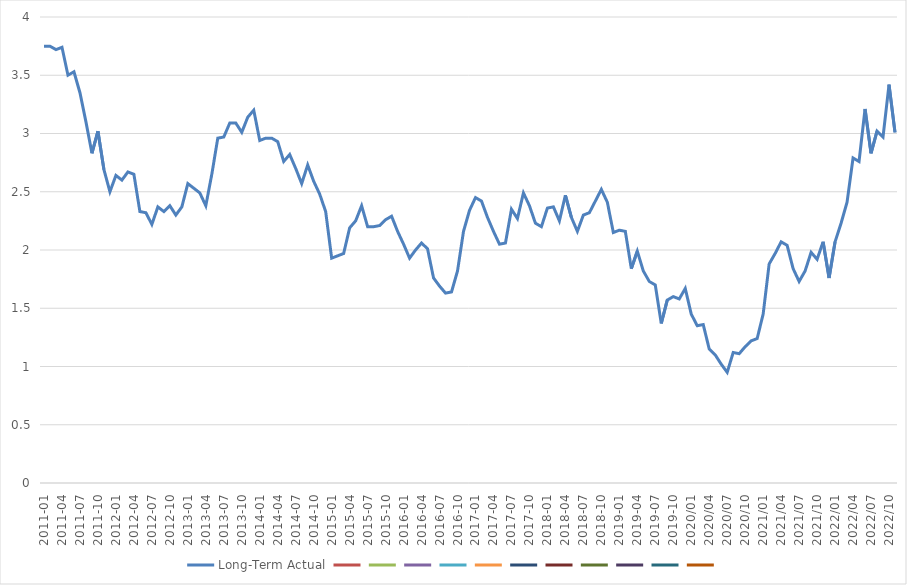
| Category | Long-Term Actual | Series 1 | Series 2 | Series 3 | Series 4 | Series 5 | Series 6 | Series 7 | Series 8 | Series 9 | Series 10 | Series 11 |
|---|---|---|---|---|---|---|---|---|---|---|---|---|
| 2011-01 | 3.75 |  |  |  |  |  |  |  |  |  |  |  |
| 2011-02 | 3.75 |  |  |  |  |  |  |  |  |  |  |  |
| 2011-03 | 3.72 |  |  |  |  |  |  |  |  |  |  |  |
| 2011-04 | 3.74 |  |  |  |  |  |  |  |  |  |  |  |
| 2011-05 | 3.5 |  |  |  |  |  |  |  |  |  |  |  |
| 2011-06 | 3.53 |  |  |  |  |  |  |  |  |  |  |  |
| 2011-07 | 3.35 |  |  |  |  |  |  |  |  |  |  |  |
| 2011-08 | 3.1 |  |  |  |  |  |  |  |  |  |  |  |
| 2011-09 | 2.83 |  |  |  |  |  |  |  |  |  |  |  |
| 2011-10 | 3.02 |  |  |  |  |  |  |  |  |  |  |  |
| 2011-11 | 2.69 |  |  |  |  |  |  |  |  |  |  |  |
| 2011-12 | 2.5 |  |  |  |  |  |  |  |  |  |  |  |
| 2012-01 | 2.64 |  |  |  |  |  |  |  |  |  |  |  |
| 2012-02 | 2.6 |  |  |  |  |  |  |  |  |  |  |  |
| 2012-03 | 2.67 |  |  |  |  |  |  |  |  |  |  |  |
| 2012-04 | 2.65 |  |  |  |  |  |  |  |  |  |  |  |
| 2012-05 | 2.33 |  |  |  |  |  |  |  |  |  |  |  |
| 2012-06 | 2.32 |  |  |  |  |  |  |  |  |  |  |  |
| 2012-07 | 2.22 |  |  |  |  |  |  |  |  |  |  |  |
| 2012-08 | 2.37 |  |  |  |  |  |  |  |  |  |  |  |
| 2012-09 | 2.33 |  |  |  |  |  |  |  |  |  |  |  |
| 2012-10 | 2.38 |  |  |  |  |  |  |  |  |  |  |  |
| 2012-11 | 2.3 |  |  |  |  |  |  |  |  |  |  |  |
| 2012-12 | 2.37 |  |  |  |  |  |  |  |  |  |  |  |
| 2013-01 | 2.57 |  |  |  |  |  |  |  |  |  |  |  |
| 2013-02 | 2.53 |  |  |  |  |  |  |  |  |  |  |  |
| 2013-03 | 2.49 |  |  |  |  |  |  |  |  |  |  |  |
| 2013-04 | 2.38 |  |  |  |  |  |  |  |  |  |  |  |
| 2013-05 | 2.65 |  |  |  |  |  |  |  |  |  |  |  |
| 2013-06 | 2.96 |  |  |  |  |  |  |  |  |  |  |  |
| 2013-07 | 2.97 |  |  |  |  |  |  |  |  |  |  |  |
| 2013-08 | 3.09 |  |  |  |  |  |  |  |  |  |  |  |
| 2013-09 | 3.09 |  |  |  |  |  |  |  |  |  |  |  |
| 2013-10 | 3.01 |  |  |  |  |  |  |  |  |  |  |  |
| 2013-11 | 3.14 |  |  |  |  |  |  |  |  |  |  |  |
| 2013-12 | 3.2 |  |  |  |  |  |  |  |  |  |  |  |
| 2014-01 | 2.94 |  |  |  |  |  |  |  |  |  |  |  |
| 2014-02 | 2.96 |  |  |  |  |  |  |  |  |  |  |  |
| 2014-03 | 2.96 |  |  |  |  |  |  |  |  |  |  |  |
| 2014-04 | 2.93 |  |  |  |  |  |  |  |  |  |  |  |
| 2014-05 | 2.76 |  |  |  |  |  |  |  |  |  |  |  |
| 2014-06 | 2.82 |  |  |  |  |  |  |  |  |  |  |  |
| 2014-07 | 2.7 |  |  |  |  |  |  |  |  |  |  |  |
| 2014-08 | 2.57 |  |  |  |  |  |  |  |  |  |  |  |
| 2014-09 | 2.73 |  |  |  |  |  |  |  |  |  |  |  |
| 2014-10 | 2.59 |  |  |  |  |  |  |  |  |  |  |  |
| 2014-11 | 2.48 |  |  |  |  |  |  |  |  |  |  |  |
| 2014-12 | 2.33 |  |  |  |  |  |  |  |  |  |  |  |
| 2015-01 | 1.93 |  |  |  |  |  |  |  |  |  |  |  |
| 2015-02 | 1.95 |  |  |  |  |  |  |  |  |  |  |  |
| 2015-03 | 1.97 |  |  |  |  |  |  |  |  |  |  |  |
| 2015-04 | 2.19 |  |  |  |  |  |  |  |  |  |  |  |
| 2015-05 | 2.25 |  |  |  |  |  |  |  |  |  |  |  |
| 2015-06 | 2.38 |  |  |  |  |  |  |  |  |  |  |  |
| 2015-07 | 2.2 |  |  |  |  |  |  |  |  |  |  |  |
| 2015-08 | 2.2 |  |  |  |  |  |  |  |  |  |  |  |
| 2015-09 | 2.21 |  |  |  |  |  |  |  |  |  |  |  |
| 2015-10 | 2.26 |  |  |  |  |  |  |  |  |  |  |  |
| 2015-11 | 2.29 |  |  |  |  |  |  |  |  |  |  |  |
| 2015-12 | 2.16 |  |  |  |  |  |  |  |  |  |  |  |
| 2016-01 | 2.05 |  |  |  |  |  |  |  |  |  |  |  |
| 2016-02 | 1.93 |  |  |  |  |  |  |  |  |  |  |  |
| 2016-03 | 2 |  |  |  |  |  |  |  |  |  |  |  |
| 2016-04 | 2.06 |  |  |  |  |  |  |  |  |  |  |  |
| 2016-05 | 2.01 |  |  |  |  |  |  |  |  |  |  |  |
| 2016-06 | 1.76 |  |  |  |  |  |  |  |  |  |  |  |
| 2016-07 | 1.69 |  |  |  |  |  |  |  |  |  |  |  |
| 2016-08 | 1.63 |  |  |  |  |  |  |  |  |  |  |  |
| 2016-09 | 1.64 |  |  |  |  |  |  |  |  |  |  |  |
| 2016-10 | 1.82 |  |  |  |  |  |  |  |  |  |  |  |
| 2016-11 | 2.16 |  |  |  |  |  |  |  |  |  |  |  |
| 2016-12 | 2.34 |  |  |  |  |  |  |  |  |  |  |  |
| 2017-01 | 2.45 |  |  |  |  |  |  |  |  |  |  |  |
| 2017-02 | 2.42 |  |  |  |  |  |  |  |  |  |  |  |
| 2017-03 | 2.28 |  |  |  |  |  |  |  |  |  |  |  |
| 2017-04 | 2.16 |  |  |  |  |  |  |  |  |  |  |  |
| 2017-05 | 2.05 |  |  |  |  |  |  |  |  |  |  |  |
| 2017-06 | 2.06 |  |  |  |  |  |  |  |  |  |  |  |
| 2017-07 | 2.35 |  |  |  |  |  |  |  |  |  |  |  |
| 2017-08 | 2.27 |  |  |  |  |  |  |  |  |  |  |  |
| 2017-09 | 2.49 |  |  |  |  |  |  |  |  |  |  |  |
| 2017-10 | 2.38 |  |  |  |  |  |  |  |  |  |  |  |
| 2017-11 | 2.23 |  |  |  |  |  |  |  |  |  |  |  |
| 2017-12 | 2.2 |  |  |  |  |  |  |  |  |  |  |  |
| 2018-01 | 2.36 |  |  |  |  |  |  |  |  |  |  |  |
| 2018-02 | 2.37 |  |  |  |  |  |  |  |  |  |  |  |
| 2018-03 | 2.25 |  |  |  |  |  |  |  |  |  |  |  |
| 2018-04 | 2.47 |  |  |  |  |  |  |  |  |  |  |  |
| 2018-05 | 2.28 |  |  |  |  |  |  |  |  |  |  |  |
| 2018-06 | 2.16 |  |  |  |  |  |  |  |  |  |  |  |
| 2018-07 | 2.3 |  |  |  |  |  |  |  |  |  |  |  |
| 2018-08 | 2.32 |  |  |  |  |  |  |  |  |  |  |  |
| 2018-09 | 2.42 |  |  |  |  |  |  |  |  |  |  |  |
| 2018-10 | 2.52 |  |  |  |  |  |  |  |  |  |  |  |
| 2018-11 | 2.41 |  |  |  |  |  |  |  |  |  |  |  |
| 2018-12 | 2.15 |  |  |  |  |  |  |  |  |  |  |  |
| 2019-01 | 2.17 |  |  |  |  |  |  |  |  |  |  |  |
| 2019-02 | 2.16 |  |  |  |  |  |  |  |  |  |  |  |
| 2019-03 | 1.84 |  |  |  |  |  |  |  |  |  |  |  |
| 2019-04 | 1.99 |  |  |  |  |  |  |  |  |  |  |  |
| 2019-05 | 1.82 |  |  |  |  |  |  |  |  |  |  |  |
| 2019-06 | 1.73 |  |  |  |  |  |  |  |  |  |  |  |
| 2019-07 | 1.7 |  |  |  |  |  |  |  |  |  |  |  |
| 2019-08 | 1.37 |  |  |  |  |  |  |  |  |  |  |  |
| 2019-09 | 1.57 |  |  |  |  |  |  |  |  |  |  |  |
| 2019-10 | 1.6 |  |  |  |  |  |  |  |  |  |  |  |
| 2019-11 | 1.58 |  |  |  |  |  |  |  |  |  |  |  |
| 2019-12 | 1.67 |  |  |  |  |  |  |  |  |  |  |  |
| 2020/01 | 1.45 |  |  |  |  |  |  |  |  |  |  |  |
| 2020/02 | 1.35 |  |  |  |  |  |  |  |  |  |  |  |
| 2020/02 | 1.36 |  |  |  |  |  |  |  |  |  |  |  |
| 2020/04 | 1.15 |  |  |  |  |  |  |  |  |  |  |  |
| 2020/05 | 1.1 |  |  |  |  |  |  |  |  |  |  |  |
| 2020/06 | 1.02 |  |  |  |  |  |  |  |  |  |  |  |
| 2020/07 | 0.95 |  |  |  |  |  |  |  |  |  |  |  |
| 2020/08 | 1.12 |  |  |  |  |  |  |  |  |  |  |  |
| 2020/09 | 1.11 |  |  |  |  |  |  |  |  |  |  |  |
| 2020/10 | 1.17 |  |  |  |  |  |  |  |  |  |  |  |
| 2020/11 | 1.22 |  |  |  |  |  |  |  |  |  |  |  |
| 2020/12 | 1.24 |  |  |  |  |  |  |  |  |  |  |  |
| 2021/01 | 1.45 |  |  |  |  |  |  |  |  |  |  |  |
| 2021/02 | 1.88 |  |  |  |  |  |  |  |  |  |  |  |
| 2021/03 | 1.97 |  |  |  |  |  |  |  |  |  |  |  |
| 2021/04 | 2.07 |  |  |  |  |  |  |  |  |  |  |  |
| 2021/05 | 2.04 |  |  |  |  |  |  |  |  |  |  |  |
| 2021/06 | 1.84 |  |  |  |  |  |  |  |  |  |  |  |
| 2021/07 | 1.73 |  |  |  |  |  |  |  |  |  |  |  |
| 2021/08 | 1.82 |  |  |  |  |  |  |  |  |  |  |  |
| 2021/09 | 1.98 |  |  |  |  |  |  |  |  |  |  |  |
| 2021/10 | 1.92 |  |  |  |  |  |  |  |  |  |  |  |
| 2021/11 | 2.07 |  |  |  |  |  |  |  |  |  |  |  |
| 2021/12 | 1.76 |  |  |  |  |  |  |  |  |  |  |  |
| 2022/01 | 2.07 |  |  |  |  |  |  |  |  |  |  |  |
| 2022/02 | 2.23 |  |  |  |  |  |  |  |  |  |  |  |
| 2022/03 | 2.41 |  |  |  |  |  |  |  |  |  |  |  |
| 2022/04 | 2.79 |  |  |  |  |  |  |  |  |  |  |  |
| 2022/05 | 2.76 |  |  |  |  |  |  |  |  |  |  |  |
| 2022/06 | 3.21 |  |  |  |  |  |  |  |  |  |  |  |
| 2022/07 | 2.83 |  |  |  |  |  |  |  |  |  |  |  |
| 2022/08 | 3.02 |  |  |  |  |  |  |  |  |  |  |  |
| 2022/09 | 2.97 |  |  |  |  |  |  |  |  |  |  |  |
| 2022/10 | 3.42 |  |  |  |  |  |  |  |  |  |  |  |
| 2022/11 | 3.01 |  |  |  |  |  |  |  |  |  |  |  |